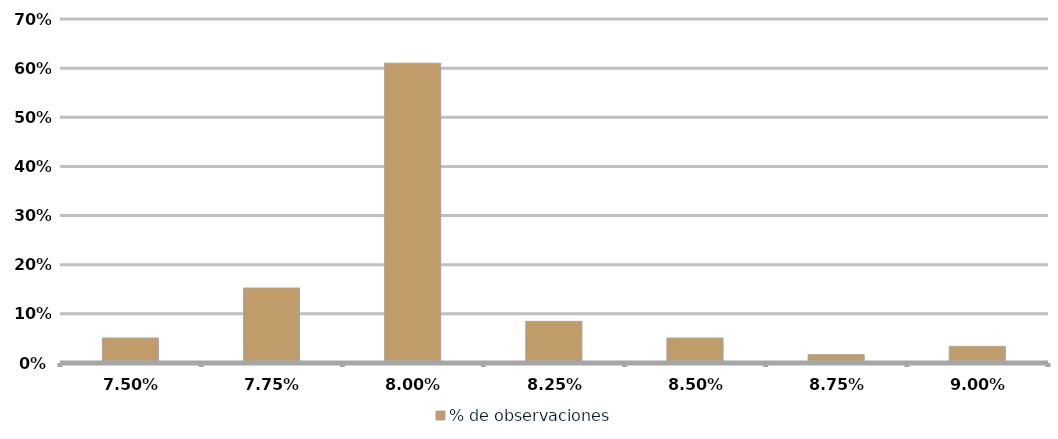
| Category | % de observaciones  |
|---|---|
| 0.075 | 0.051 |
| 0.0775 | 0.153 |
| 0.08 | 0.61 |
| 0.0825 | 0.085 |
| 0.085 | 0.051 |
| 0.08750000000000001 | 0.017 |
| 0.09000000000000001 | 0.034 |